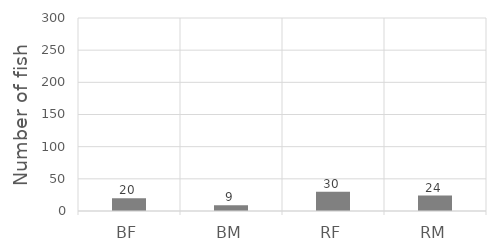
| Category | Series 0 |
|---|---|
| BF | 20 |
| BM | 9 |
| RF | 30 |
| RM | 24 |